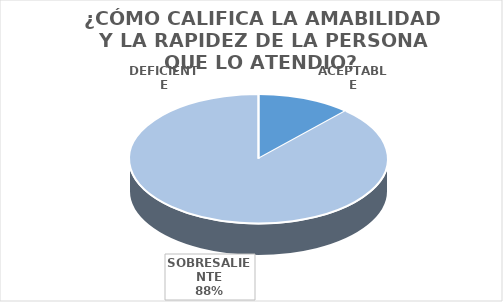
| Category | Series 0 |
|---|---|
| DEFICIENTE | 0 |
| ACEPTABLE | 2 |
| SOBRESALIENTE | 15 |